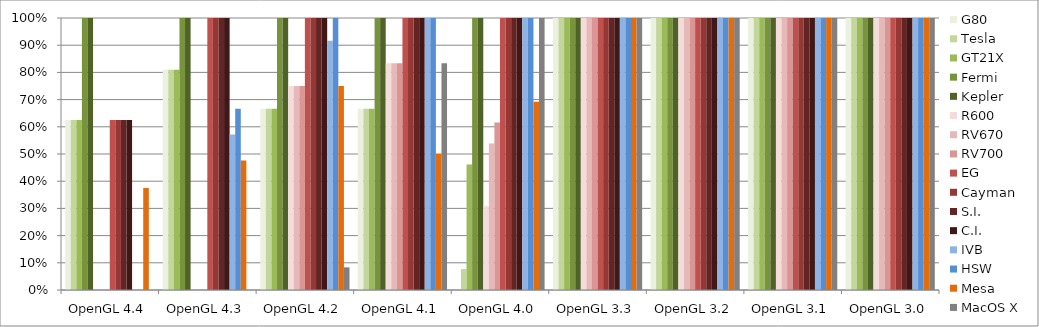
| Category | G80 | Tesla | GT21X | Fermi | Kepler | R600 | RV670 | RV700 | EG | Cayman | S.I. | C.I. | IVB | HSW | Mesa | MacOS X |
|---|---|---|---|---|---|---|---|---|---|---|---|---|---|---|---|---|
| OpenGL 4.4 | 0.625 | 0.625 | 0.625 | 1 | 1 | 0 | 0 | 0 | 0.625 | 0.625 | 0.625 | 0.625 | 0 | 0 | 0.375 | 0 |
| OpenGL 4.3 | 0.81 | 0.81 | 0.81 | 1 | 1 | 0 | 0 | 0 | 1 | 1 | 1 | 1 | 0.571 | 0.667 | 0.476 | 0 |
| OpenGL 4.2 | 0.667 | 0.667 | 0.667 | 1 | 1 | 0.75 | 0.75 | 0.75 | 1 | 1 | 1 | 1 | 0.917 | 1 | 0.75 | 0.083 |
| OpenGL 4.1 | 0.667 | 0.667 | 0.667 | 1 | 1 | 0.833 | 0.833 | 0.833 | 1 | 1 | 1 | 1 | 1 | 1 | 0.5 | 0.833 |
| OpenGL 4.0 | 0 | 0.077 | 0.462 | 1 | 1 | 0.308 | 0.538 | 0.615 | 1 | 1 | 1 | 1 | 1 | 1 | 0.692 | 1 |
| OpenGL 3.3 | 1 | 1 | 1 | 1 | 1 | 1 | 1 | 1 | 1 | 1 | 1 | 1 | 1 | 1 | 1 | 1 |
| OpenGL 3.2 | 1 | 1 | 1 | 1 | 1 | 1 | 1 | 1 | 1 | 1 | 1 | 1 | 1 | 1 | 1 | 1 |
| OpenGL 3.1 | 1 | 1 | 1 | 1 | 1 | 1 | 1 | 1 | 1 | 1 | 1 | 1 | 1 | 1 | 1 | 1 |
| OpenGL 3.0 | 1 | 1 | 1 | 1 | 1 | 1 | 1 | 1 | 1 | 1 | 1 | 1 | 1 | 1 | 1 | 1 |